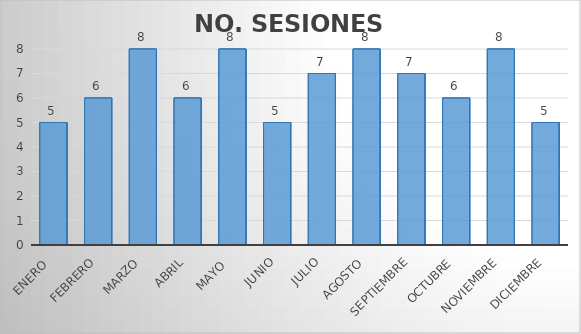
| Category | NO. SESIONES EFECTUADAS |
|---|---|
| Enero  | 5 |
| Febrero | 6 |
| Marzo | 8 |
| Abril | 6 |
| Mayo  | 8 |
| Junio | 5 |
| Julio | 7 |
| Agosto | 8 |
| Septiembre | 7 |
| Octubre | 6 |
| Noviembre | 8 |
| Diciembre | 5 |